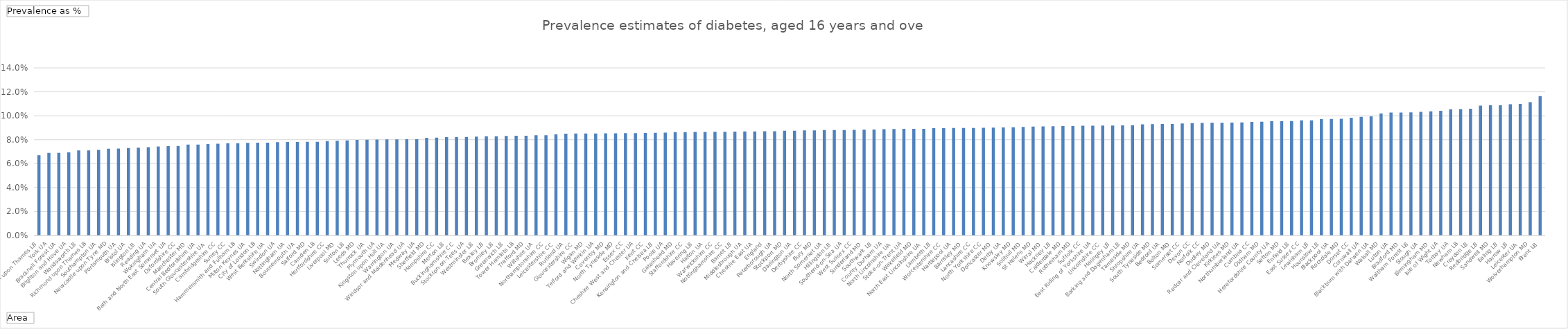
| Category | Total |
|---|---|
| Kingston upon Thames LB | 0.067 |
| York UA | 0.069 |
| Bracknell Forest UA | 0.069 |
| Brighton and Hove UA | 0.069 |
| Wandsworth LB | 0.071 |
| Richmond upon Thames LB | 0.071 |
| Southampton UA | 0.072 |
| Newcastle upon Tyne MD | 0.072 |
| Portsmouth UA | 0.073 |
| Bristol UA | 0.073 |
| Islington LB | 0.073 |
| Reading UA | 0.074 |
| Wokingham UA | 0.074 |
| Bath and North East Somerset UA | 0.075 |
| Oxfordshire CC | 0.075 |
| Manchester MD | 0.076 |
| Central Bedfordshire UA | 0.076 |
| South Gloucestershire UA | 0.076 |
| Cambridgeshire CC | 0.077 |
| Surrey CC | 0.077 |
| Hammersmith and Fulham LB | 0.077 |
| Milton Keynes UA | 0.077 |
| City of London LB | 0.078 |
| West Berkshire UA | 0.078 |
| Swindon UA | 0.078 |
| Nottingham UA | 0.078 |
| Bournemouth UA | 0.078 |
| Salford MD | 0.078 |
| Camden LB | 0.078 |
| Hertfordshire CC | 0.079 |
| Liverpool MD | 0.079 |
| Sutton LB | 0.079 |
| Leeds MD | 0.08 |
| Thurrock UA | 0.08 |
| Plymouth UA | 0.08 |
| Kingston upon Hull UA | 0.08 |
| Warrington UA | 0.08 |
| Windsor and Maidenhead UA | 0.08 |
| Medway UA | 0.08 |
| Sheffield MD | 0.082 |
| Hampshire CC | 0.082 |
| Merton LB | 0.082 |
| Buckinghamshire CC | 0.082 |
| Stockton-on-Tees UA | 0.082 |
| Westminster LB | 0.083 |
| Bexley LB | 0.083 |
| Bromley LB | 0.083 |
| Greenwich LB | 0.083 |
| Tower Hamlets LB | 0.083 |
| Trafford MD | 0.083 |
| Wiltshire UA | 0.084 |
| Northamptonshire CC | 0.084 |
| Leicestershire CC | 0.085 |
| Rutland UA | 0.085 |
| Gloucestershire CC | 0.085 |
| Wigan MD | 0.085 |
| Telford and Wrekin UA | 0.085 |
| Coventry MD | 0.085 |
| North Tyneside MD | 0.085 |
| Essex CC | 0.085 |
| Cheshire West and Chester UA | 0.086 |
| Kent CC | 0.086 |
| Kensington and Chelsea LB | 0.086 |
| Poole UA | 0.086 |
| Gateshead MD | 0.086 |
| Staffordshire CC | 0.086 |
| Havering LB | 0.086 |
| Halton UA | 0.086 |
| Warwickshire CC | 0.087 |
| Nottinghamshire CC | 0.087 |
| Barnet LB | 0.087 |
| Middlesbrough UA | 0.087 |
| Cheshire East UA | 0.087 |
| England | 0.087 |
| Peterborough UA | 0.087 |
| Stockport MD | 0.087 |
| Darlington UA | 0.088 |
| Derbyshire CC | 0.088 |
| Bury MD | 0.088 |
| North Somerset UA | 0.088 |
| Hillingdon LB | 0.088 |
| Southend-on-Sea UA | 0.088 |
| West Sussex CC | 0.088 |
| Sunderland MD | 0.088 |
| Southwark LB | 0.088 |
| County Durham UA | 0.089 |
| North Lincolnshire UA | 0.089 |
| Stoke-on-Trent UA | 0.089 |
| Wakefield MD | 0.089 |
| North East Lincolnshire UA | 0.089 |
| Lambeth LB | 0.09 |
| Worcestershire CC | 0.09 |
| Hartlepool UA | 0.09 |
| Barnsley MD | 0.09 |
| Lancashire CC | 0.09 |
| North Yorkshire CC | 0.09 |
| Doncaster MD | 0.09 |
| Derby UA | 0.09 |
| Knowsley MD | 0.09 |
| Solihull MD | 0.091 |
| St Helens MD | 0.091 |
| Wirral MD | 0.091 |
| Hackney LB | 0.091 |
| Calderdale MD | 0.091 |
| Rotherham MD | 0.091 |
| Suffolk CC | 0.092 |
| East Riding of Yorkshire UA | 0.092 |
| Lincolnshire CC | 0.092 |
| Haringey LB | 0.092 |
| Barking and Dagenham LB | 0.092 |
| Tameside MD | 0.092 |
| Shropshire UA | 0.093 |
| South Tyneside MD | 0.093 |
| Bedford UA | 0.093 |
| Bolton MD | 0.093 |
| Somerset CC | 0.094 |
| Devon CC | 0.094 |
| Norfolk CC | 0.094 |
| Dudley MD | 0.094 |
| Redcar and Cleveland UA | 0.094 |
| Kirklees MD | 0.094 |
| Northumberland UA | 0.094 |
| Cumbria CC | 0.095 |
| Oldham MD | 0.095 |
| Herefordshire County UA | 0.095 |
| Sefton MD | 0.095 |
| Enfield LB | 0.096 |
| East Sussex CC | 0.096 |
| Lewisham LB | 0.096 |
| Hounslow LB | 0.097 |
| Blackpool UA | 0.097 |
| Rochdale MD | 0.097 |
| Dorset CC | 0.098 |
| Cornwall UA | 0.099 |
| Blackburn with Darwen UA | 0.1 |
| Walsall MD | 0.102 |
| Luton UA | 0.103 |
| Bradford MD | 0.103 |
| Waltham Forest LB | 0.103 |
| Slough UA | 0.103 |
| Birmingham MD | 0.104 |
| Isle of Wight UA | 0.104 |
| Torbay UA | 0.105 |
| Newham LB | 0.106 |
| Croydon LB | 0.106 |
| Redbridge LB | 0.108 |
| Sandwell MD | 0.109 |
| Ealing LB | 0.109 |
| Harrow LB | 0.11 |
| Leicester UA | 0.11 |
| Wolverhampton MD | 0.111 |
| Brent LB | 0.116 |